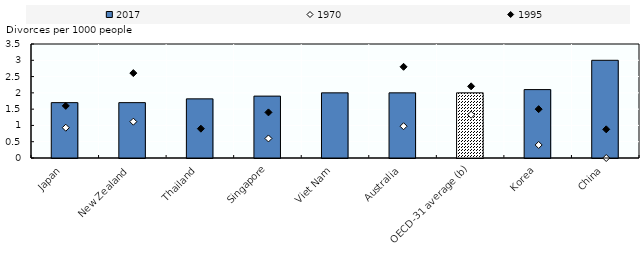
| Category | 2017 |
|---|---|
| Japan | 1.7 |
| New Zealand | 1.7 |
| Thailand | 1.815 |
| Singapore | 1.9 |
| Viet Nam | 2 |
| Australia | 2 |
| OECD-31 average (b) | 2 |
| Korea | 2.1 |
| China | 3 |